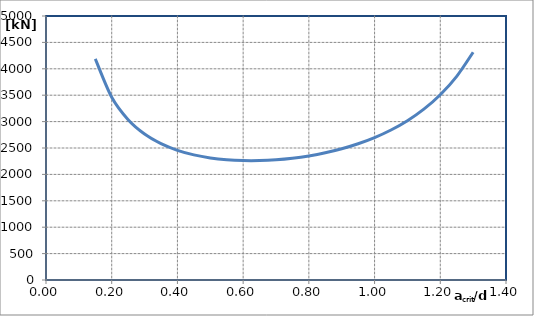
| Category | Series 0 |
|---|---|
| 1.3 | 4313.219 |
| 1.25 | 3857.215 |
| 1.2 | 3508.438 |
| 1.15 | 3234.993 |
| 1.0999999999999999 | 3016.751 |
| 1.0499999999999998 | 2840.43 |
| 0.9999999999999998 | 2696.971 |
| 0.9499999999999997 | 2580.046 |
| 0.8999999999999997 | 2485.173 |
| 0.8499999999999996 | 2409.185 |
| 0.7999999999999996 | 2349.887 |
| 0.7499999999999996 | 2305.863 |
| 0.6999999999999995 | 2276.362 |
| 0.6499999999999995 | 2261.27 |
| 0.5999999999999994 | 2261.142 |
| 0.5499999999999994 | 2277.338 |
| 0.4999999999999994 | 2312.275 |
| 0.4499999999999994 | 2369.897 |
| 0.3999999999999994 | 2456.524 |
| 0.3499999999999994 | 2582.461 |
| 0.29999999999999943 | 2765.236 |
| 0.24999999999999944 | 3036.747 |
| 0.19999999999999946 | 3461.142 |
| 0.14999999999999947 | 4188.495 |